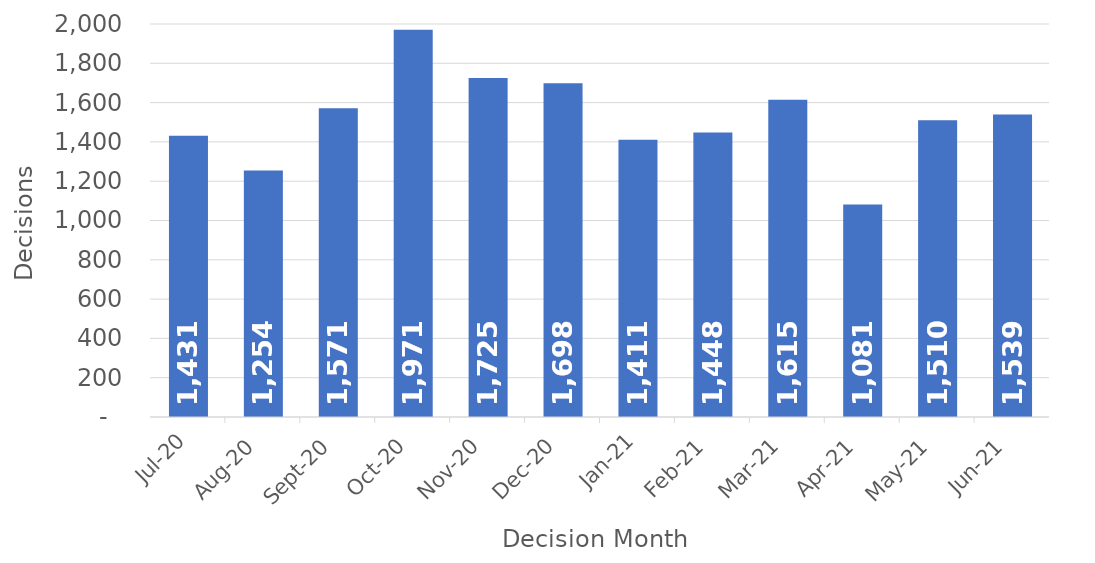
| Category | Decisions |
|---|---|
| 2020-07-01 | 1431 |
| 2020-08-01 | 1254 |
| 2020-09-01 | 1571 |
| 2020-10-01 | 1971 |
| 2020-11-01 | 1725 |
| 2020-12-01 | 1698 |
| 2021-01-01 | 1411 |
| 2021-02-01 | 1448 |
| 2021-03-01 | 1615 |
| 2021-04-01 | 1081 |
| 2021-05-01 | 1510 |
| 2021-06-01 | 1539 |